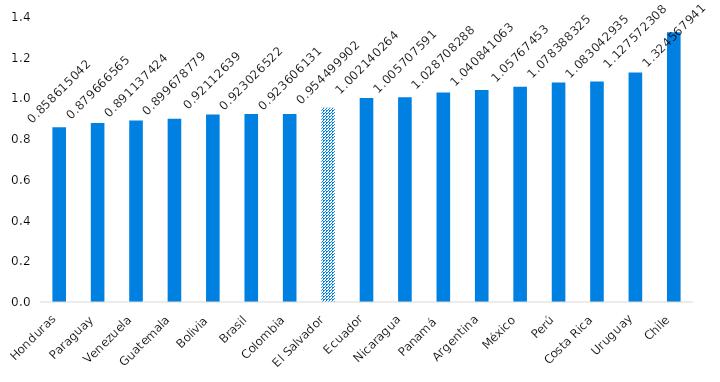
| Category | PSP (2004-2014) |
|---|---|
| Honduras | 0.859 |
| Paraguay | 0.88 |
| Venezuela | 0.891 |
| Guatemala | 0.9 |
| Bolivia | 0.921 |
| Brasil | 0.923 |
| Colombia | 0.924 |
| El Salvador | 0.954 |
| Ecuador | 1.002 |
| Nicaragua | 1.006 |
| Panamá  | 1.029 |
| Argentina | 1.041 |
| México | 1.058 |
| Perú | 1.078 |
| Costa Rica | 1.083 |
| Uruguay | 1.128 |
| Chile | 1.325 |